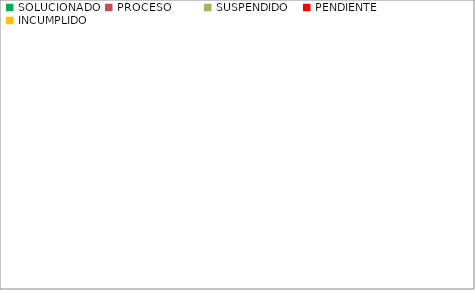
| Category | Series 0 |
|---|---|
| SOLUCIONADO | 11 |
| PROCESO | 1 |
| SUSPENDIDO | 1 |
| PENDIENTE | 5 |
| INCUMPLIDO | 1 |